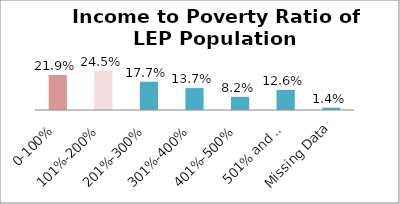
| Category | Percent |
|---|---|
| 0-100% | 0.219 |
| 101%-200% | 0.245 |
| 201%-300% | 0.177 |
| 301%-400% | 0.137 |
| 401%-500% | 0.082 |
| 501% and Over | 0.126 |
| Missing Data | 0.014 |